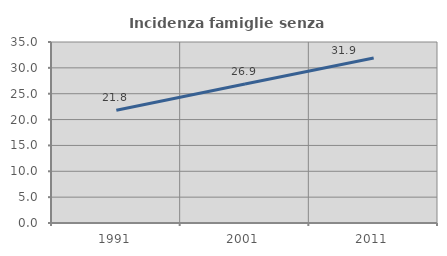
| Category | Incidenza famiglie senza nuclei |
|---|---|
| 1991.0 | 21.806 |
| 2001.0 | 26.883 |
| 2011.0 | 31.913 |